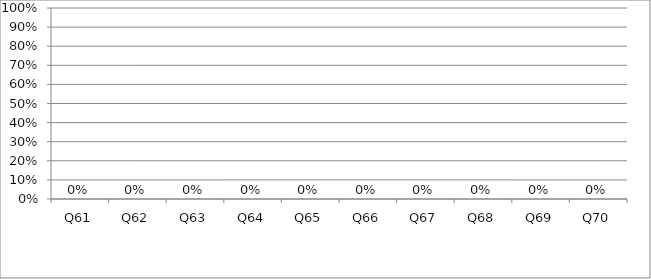
| Category | GEOGRAFIA |
|---|---|
| Q61 | 0 |
| Q62 | 0 |
| Q63 | 0 |
| Q64 | 0 |
| Q65 | 0 |
| Q66 | 0 |
| Q67 | 0 |
| Q68 | 0 |
| Q69 | 0 |
| Q70 | 0 |